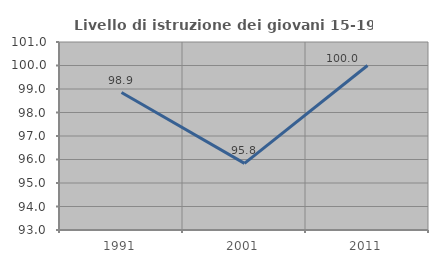
| Category | Livello di istruzione dei giovani 15-19 anni |
|---|---|
| 1991.0 | 98.851 |
| 2001.0 | 95.833 |
| 2011.0 | 100 |